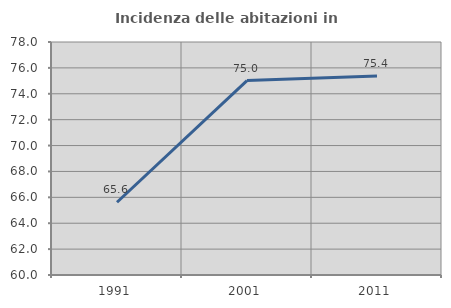
| Category | Incidenza delle abitazioni in proprietà  |
|---|---|
| 1991.0 | 65.618 |
| 2001.0 | 75.023 |
| 2011.0 | 75.378 |